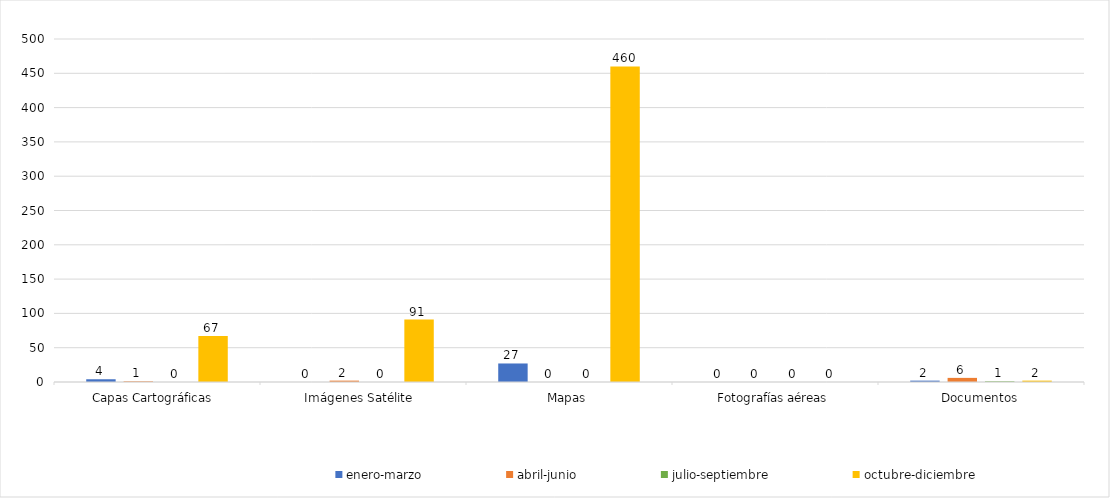
| Category | enero-marzo | abril-junio | julio-septiembre | octubre-diciembre |
|---|---|---|---|---|
| Capas Cartográficas  | 4 | 1 | 0 | 67 |
| Imágenes Satélite  | 0 | 2 | 0 | 91 |
| Mapas | 27 | 0 | 0 | 460 |
| Fotografías aéreas | 0 | 0 | 0 | 0 |
| Documentos | 2 | 6 | 1 | 2 |